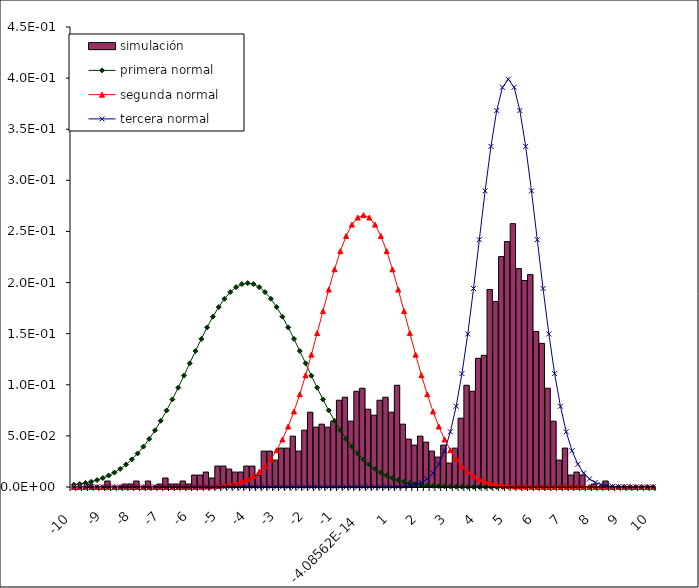
| Category | simulación |
|---|---|
| -10.0 | 0 |
| -9.8 | 0 |
| -9.6 | 0 |
| -9.4 | 0.003 |
| -9.2 | 0 |
| -9.0 | 0 |
| -8.8 | 0.006 |
| -8.6 | 0 |
| -8.40000000000001 | 0 |
| -8.20000000000001 | 0.003 |
| -8.00000000000001 | 0.003 |
| -7.80000000000001 | 0.006 |
| -7.60000000000001 | 0 |
| -7.40000000000001 | 0.006 |
| -7.20000000000001 | 0 |
| -7.00000000000001 | 0.003 |
| -6.80000000000001 | 0.009 |
| -6.60000000000001 | 0.003 |
| -6.40000000000001 | 0.003 |
| -6.20000000000001 | 0.006 |
| -6.00000000000001 | 0.003 |
| -5.80000000000001 | 0.012 |
| -5.60000000000002 | 0.012 |
| -5.40000000000002 | 0.015 |
| -5.20000000000002 | 0.009 |
| -5.00000000000002 | 0.02 |
| -4.80000000000002 | 0.02 |
| -4.60000000000002 | 0.018 |
| -4.40000000000002 | 0.015 |
| -4.20000000000002 | 0.015 |
| -4.00000000000002 | 0.02 |
| -3.80000000000002 | 0.02 |
| -3.60000000000002 | 0.012 |
| -3.40000000000002 | 0.035 |
| -3.20000000000002 | 0.035 |
| -3.00000000000002 | 0.026 |
| -2.80000000000003 | 0.038 |
| -2.60000000000003 | 0.038 |
| -2.40000000000003 | 0.05 |
| -2.20000000000003 | 0.035 |
| -2.00000000000003 | 0.056 |
| -1.80000000000003 | 0.073 |
| -1.60000000000003 | 0.059 |
| -1.40000000000003 | 0.061 |
| -1.20000000000003 | 0.059 |
| -1.00000000000003 | 0.064 |
| -0.800000000000029 | 0.085 |
| -0.60000000000003 | 0.088 |
| -0.400000000000031 | 0.064 |
| -0.200000000000029 | 0.094 |
| -4.08562073062058e-14 | 0.097 |
| 0.199999999999999 | 0.076 |
| 0.4 | 0.07 |
| 0.6 | 0.085 |
| 0.800000000000001 | 0.088 |
| 1.0 | 0.073 |
| 1.2 | 0.1 |
| 1.4 | 0.061 |
| 1.6 | 0.047 |
| 1.8 | 0.041 |
| 2.0 | 0.05 |
| 2.2 | 0.044 |
| 2.4 | 0.035 |
| 2.6 | 0.029 |
| 2.8 | 0.041 |
| 3.0 | 0.023 |
| 3.2 | 0.038 |
| 3.4 | 0.067 |
| 3.6 | 0.1 |
| 3.8 | 0.094 |
| 4.0 | 0.126 |
| 4.1999999999999 | 0.129 |
| 4.3999999999999 | 0.193 |
| 4.5999999999999 | 0.181 |
| 4.7999999999999 | 0.225 |
| 4.9999999999999 | 0.24 |
| 5.1999999999999 | 0.258 |
| 5.3999999999999 | 0.214 |
| 5.5999999999999 | 0.202 |
| 5.7999999999999 | 0.208 |
| 5.9999999999999 | 0.152 |
| 6.1999999999999 | 0.141 |
| 6.3999999999999 | 0.097 |
| 6.5999999999999 | 0.064 |
| 6.7999999999999 | 0.026 |
| 6.9999999999999 | 0.038 |
| 7.1999999999999 | 0.012 |
| 7.3999999999999 | 0.015 |
| 7.5999999999999 | 0.012 |
| 7.7999999999999 | 0 |
| 7.9999999999999 | 0.003 |
| 8.1999999999999 | 0 |
| 8.3999999999999 | 0.006 |
| 8.5999999999999 | 0 |
| 8.7999999999999 | 0 |
| 8.9999999999999 | 0 |
| 9.1999999999999 | 0 |
| 9.3999999999999 | 0 |
| 9.5999999999999 | 0 |
| 9.7999999999999 | 0 |
| 9.9999999999999 | 0 |